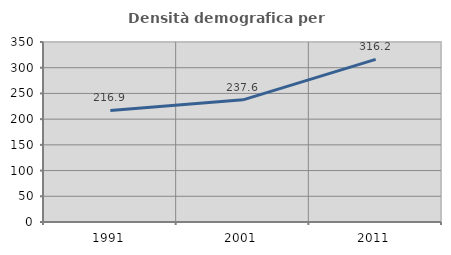
| Category | Densità demografica |
|---|---|
| 1991.0 | 216.882 |
| 2001.0 | 237.587 |
| 2011.0 | 316.204 |